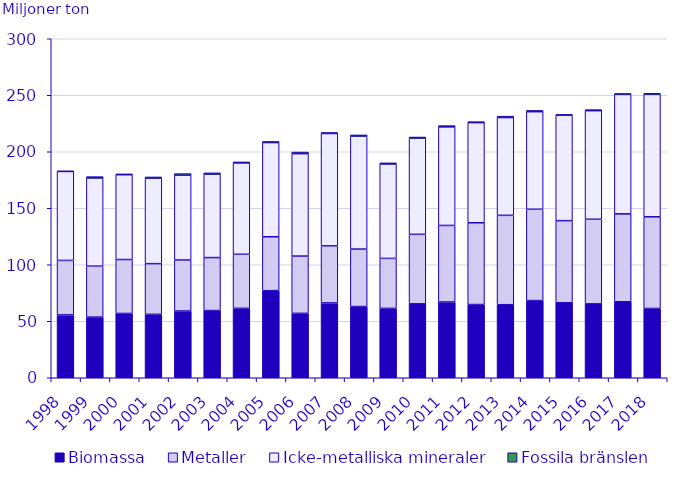
| Category | Biomassa | Metaller | Icke-metalliska mineraler | Fossila bränslen |
|---|---|---|---|---|
| 1998.0 | 55.605 | 48.234 | 78.756 | 0.319 |
| 1999.0 | 53.658 | 45.113 | 77.989 | 1.234 |
| 2000.0 | 56.896 | 47.732 | 75.055 | 0.712 |
| 2001.0 | 56.119 | 44.862 | 75.561 | 1.169 |
| 2002.0 | 59.06 | 45.156 | 75.047 | 1.406 |
| 2003.0 | 59.466 | 46.889 | 73.732 | 1.243 |
| 2004.0 | 61.445 | 47.83 | 80.845 | 0.894 |
| 2005.0 | 77.068 | 47.687 | 83.378 | 1 |
| 2006.0 | 56.978 | 50.691 | 90.646 | 1.427 |
| 2007.0 | 66.226 | 50.466 | 99.471 | 0.878 |
| 2008.0 | 63.014 | 50.844 | 99.977 | 1.071 |
| 2009.0 | 61.399 | 44.222 | 83.551 | 1.002 |
| 2010.0 | 65.421 | 61.516 | 85.067 | 1.039 |
| 2011.0 | 67.068 | 67.717 | 87.229 | 1.125 |
| 2012.0 | 64.789 | 72.374 | 88.61 | 0.847 |
| 2013.0 | 64.637 | 79.086 | 86.528 | 1.255 |
| 2014.0 | 68.303 | 80.836 | 86.326 | 1.112 |
| 2015.0 | 66.335 | 72.694 | 93.26 | 0.718 |
| 2016.0 | 65.388 | 74.864 | 96.106 | 0.925 |
| 2017.0 | 67.259 | 77.785 | 105.683 | 0.825 |
| 2018.0 | 61.277 | 81.173 | 108.293 | 1.04 |